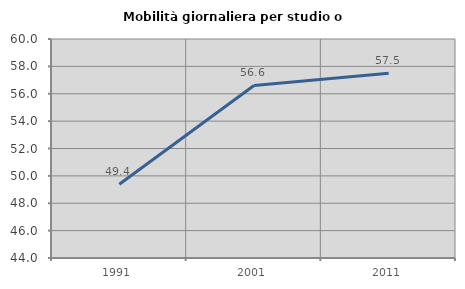
| Category | Mobilità giornaliera per studio o lavoro |
|---|---|
| 1991.0 | 49.387 |
| 2001.0 | 56.604 |
| 2011.0 | 57.492 |